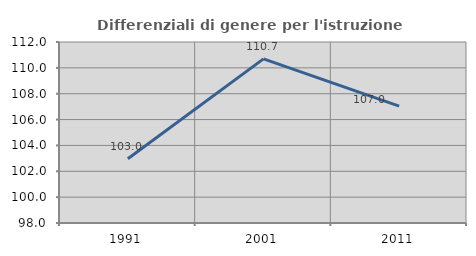
| Category | Differenziali di genere per l'istruzione superiore |
|---|---|
| 1991.0 | 102.972 |
| 2001.0 | 110.697 |
| 2011.0 | 107.037 |